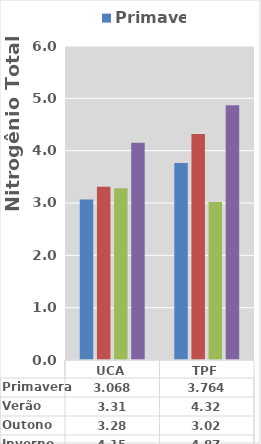
| Category | Primavera | Verão | Outono | Inverno |
|---|---|---|---|---|
| UCA | 3.068 | 3.31 | 3.28 | 4.15 |
| TPF | 3.764 | 4.32 | 3.02 | 4.87 |